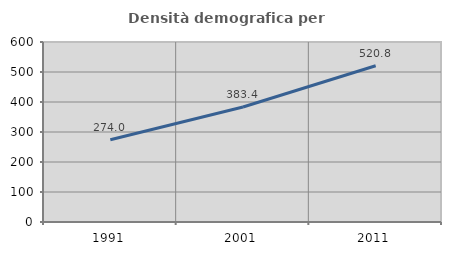
| Category | Densità demografica |
|---|---|
| 1991.0 | 274.03 |
| 2001.0 | 383.396 |
| 2011.0 | 520.78 |